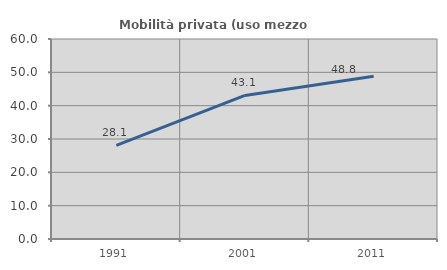
| Category | Mobilità privata (uso mezzo privato) |
|---|---|
| 1991.0 | 28.08 |
| 2001.0 | 43.08 |
| 2011.0 | 48.806 |